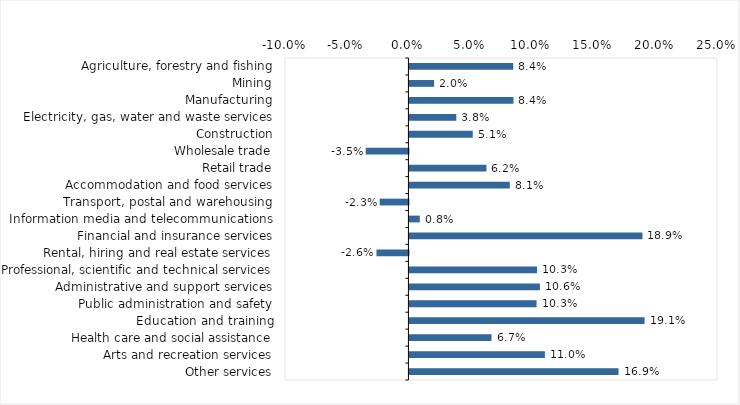
| Category | This week |
|---|---|
| Agriculture, forestry and fishing | 0.084 |
| Mining | 0.02 |
| Manufacturing | 0.084 |
| Electricity, gas, water and waste services | 0.038 |
| Construction | 0.051 |
| Wholesale trade | -0.035 |
| Retail trade | 0.062 |
| Accommodation and food services | 0.081 |
| Transport, postal and warehousing | -0.023 |
| Information media and telecommunications | 0.008 |
| Financial and insurance services | 0.189 |
| Rental, hiring and real estate services | -0.026 |
| Professional, scientific and technical services | 0.103 |
| Administrative and support services | 0.106 |
| Public administration and safety | 0.103 |
| Education and training | 0.19 |
| Health care and social assistance | 0.066 |
| Arts and recreation services | 0.11 |
| Other services | 0.169 |